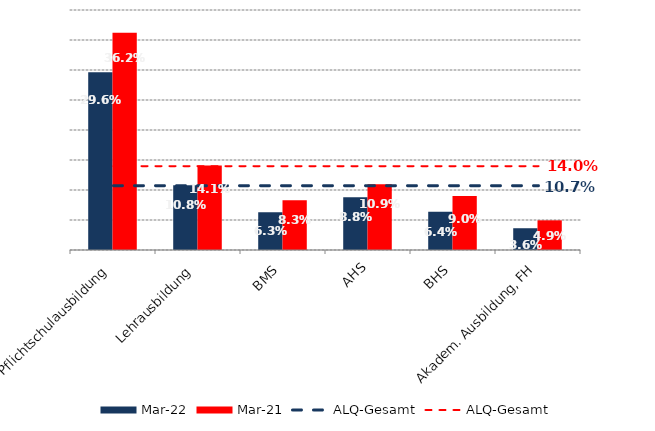
| Category | Mrz 22 | Mrz 21 |
|---|---|---|
| Pflichtschulausbildung | 0.296 | 0.362 |
| Lehrausbildung | 0.108 | 0.141 |
| BMS | 0.063 | 0.083 |
| AHS | 0.088 | 0.109 |
| BHS | 0.064 | 0.09 |
| Akadem. Ausbildung, FH | 0.036 | 0.049 |